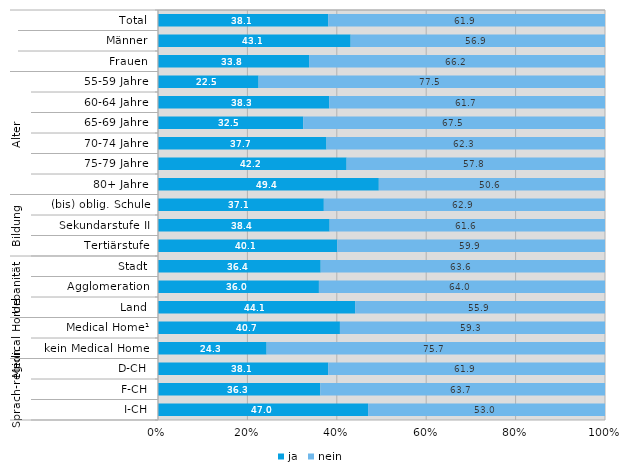
| Category | ja | nein |
|---|---|---|
| 0 | 38.1 | 61.9 |
| 1 | 43.1 | 56.9 |
| 2 | 33.8 | 66.2 |
| 3 | 22.5 | 77.5 |
| 4 | 38.3 | 61.7 |
| 5 | 32.5 | 67.5 |
| 6 | 37.7 | 62.3 |
| 7 | 42.2 | 57.8 |
| 8 | 49.4 | 50.6 |
| 9 | 37.1 | 62.9 |
| 10 | 38.4 | 61.6 |
| 11 | 40.1 | 59.9 |
| 12 | 36.4 | 63.6 |
| 13 | 36 | 64 |
| 14 | 44.1 | 55.9 |
| 15 | 40.7 | 59.3 |
| 16 | 24.3 | 75.7 |
| 17 | 38.1 | 61.9 |
| 18 | 36.3 | 63.7 |
| 19 | 47 | 53 |